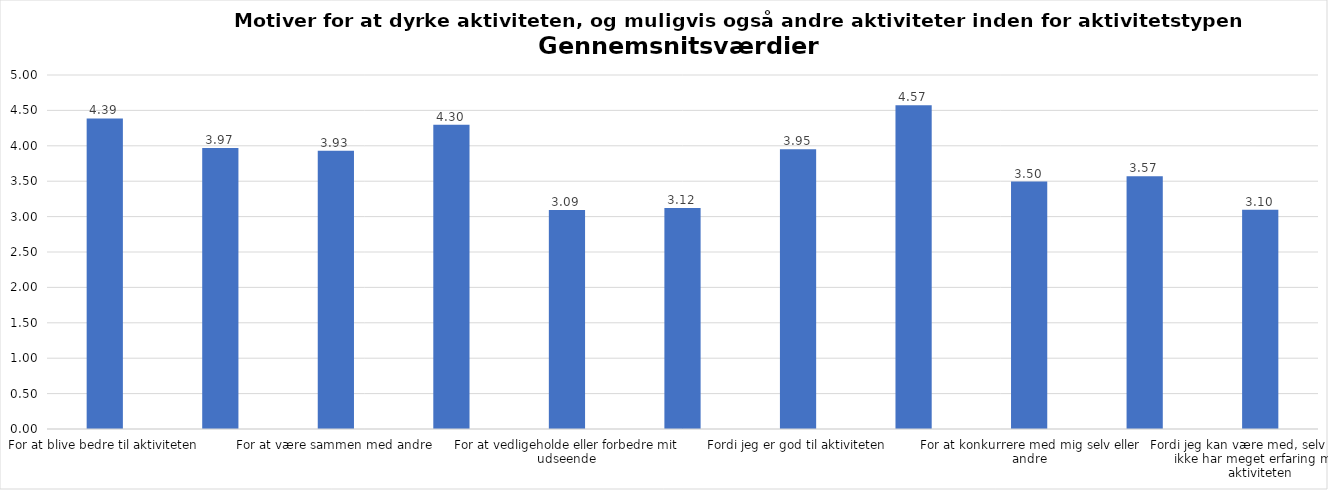
| Category | Gennemsnit |
|---|---|
| For at blive bedre til aktiviteten | 4.387 |
| For at vedligeholde eller forbedre min sundhed (fx helbred, fysisk form) | 3.971 |
| For at være sammen med andre | 3.931 |
| For at gøre noget godt for mig selv | 4.299 |
| For at vedligeholde eller forbedre mit udseende | 3.093 |
| Fordi andre i min omgangskreds opmuntrer mig til det | 3.123 |
| Fordi jeg er god til aktiviteten | 3.951 |
| Fordi jeg godt kan lide aktiviteten | 4.574 |
| For at konkurrere med mig selv eller andre | 3.495 |
| Fordi aktiviteten passer godt ind i min hverdag | 3.569 |
| Fordi jeg kan være med, selv om jeg ikke har meget erfaring med aktiviteten | 3.098 |